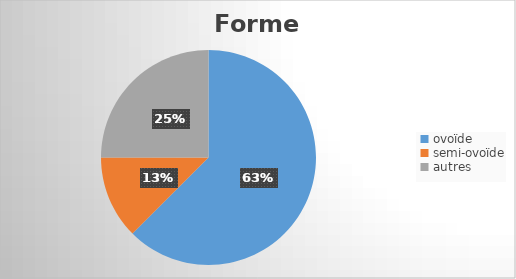
| Category | Series 0 |
|---|---|
| ovoïde | 15 |
| semi-ovoïde | 3 |
| autres | 6 |